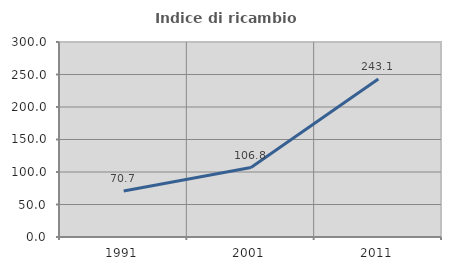
| Category | Indice di ricambio occupazionale  |
|---|---|
| 1991.0 | 70.652 |
| 2001.0 | 106.849 |
| 2011.0 | 243.077 |